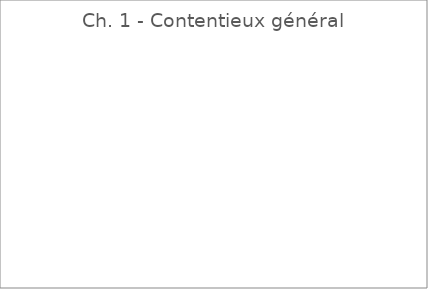
| Category | Ch. 1 - Contentieux général |
|---|---|
| A. DAMERON | 0 |
| N. de SCHONEN | 0 |
| G. PLOCQ | 0 |
| J.-F. JAVIER | 0 |
| J. PARADIS | 0 |
| F. JACQUIER | 0 |
| Ph. BONDUELLE | 0 |
| P. DELABARRE | 0 |
| A. SCHEID | 0 |
| O. TASSAN | 0 |
| Ch. COTELLE | 0 |
| M. DAVID | 0 |
| D. DAEVIDIAK | 0 |